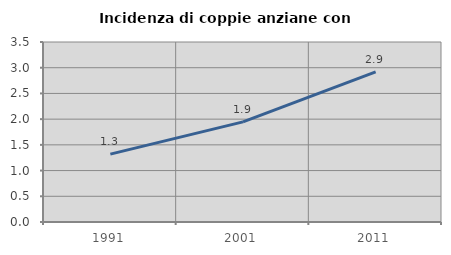
| Category | Incidenza di coppie anziane con figli |
|---|---|
| 1991.0 | 1.32 |
| 2001.0 | 1.946 |
| 2011.0 | 2.92 |